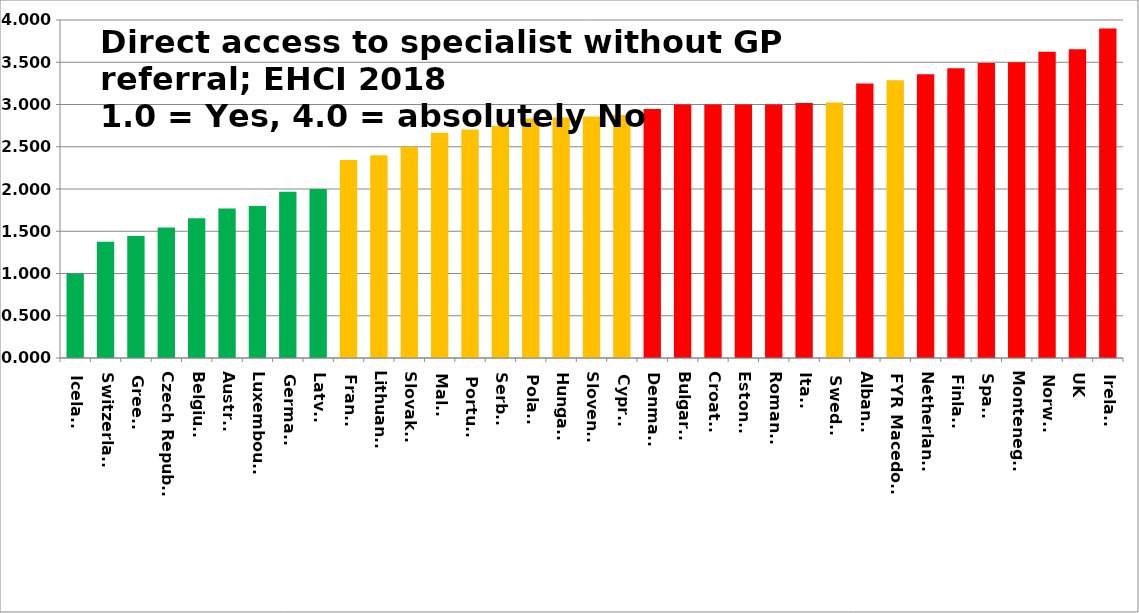
| Category | Series 0 |
|---|---|
| Iceland | 1 |
| Switzerland | 1.375 |
| Greece | 1.444 |
| Czech Republic | 1.545 |
| Belgium | 1.655 |
| Austria | 1.769 |
| Luxembourg | 1.8 |
| Germany | 1.966 |
| Latvia | 2 |
| France | 2.343 |
| Lithuania | 2.4 |
| Slovakia | 2.5 |
| Malta | 2.667 |
| Portugal | 2.704 |
| Serbia | 2.75 |
| Poland | 2.833 |
| Hungary | 2.846 |
| Slovenia | 2.857 |
| Cyprus | 2.875 |
| Denmark | 2.947 |
| Bulgaria | 3 |
| Croatia | 3 |
| Estonia | 3 |
| Romania | 3 |
| Italy | 3.018 |
| Sweden | 3.024 |
| Albania | 3.25 |
| FYR Macedonia | 3.286 |
| Netherlands | 3.357 |
| Finland | 3.429 |
| Spain | 3.491 |
| Montenegro | 3.5 |
| Norway | 3.625 |
| UK | 3.655 |
| Ireland | 3.9 |